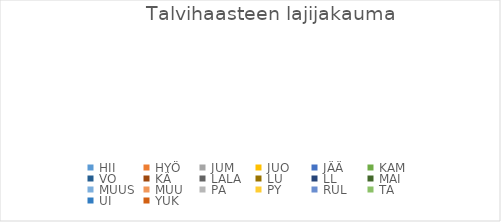
| Category | Series 0 |
|---|---|
| HII | 0 |
| HYÖ | 0 |
| JUM | 0 |
| JUO | 0 |
| JÄÄ | 0 |
| KAM | 0 |
| VO | 0 |
| KÄ | 0 |
| LALA | 0 |
| LU | 0 |
| LL | 0 |
| MAI | 0 |
| MUUS | 0 |
| MUU | 0 |
| PA | 0 |
| PY | 0 |
| RUL | 0 |
| TA | 0 |
| UI | 0 |
| YUK | 0 |